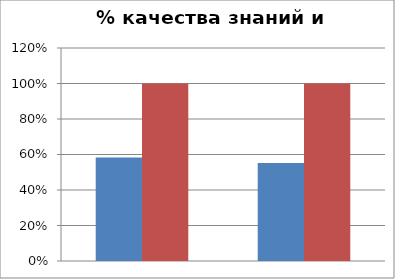
| Category | Series 0 | 2 |
|---|---|---|
| Хакунова Ж.М. | 0.583 | 1 |
| Губжокова Р.Х. | 0.552 | 1 |